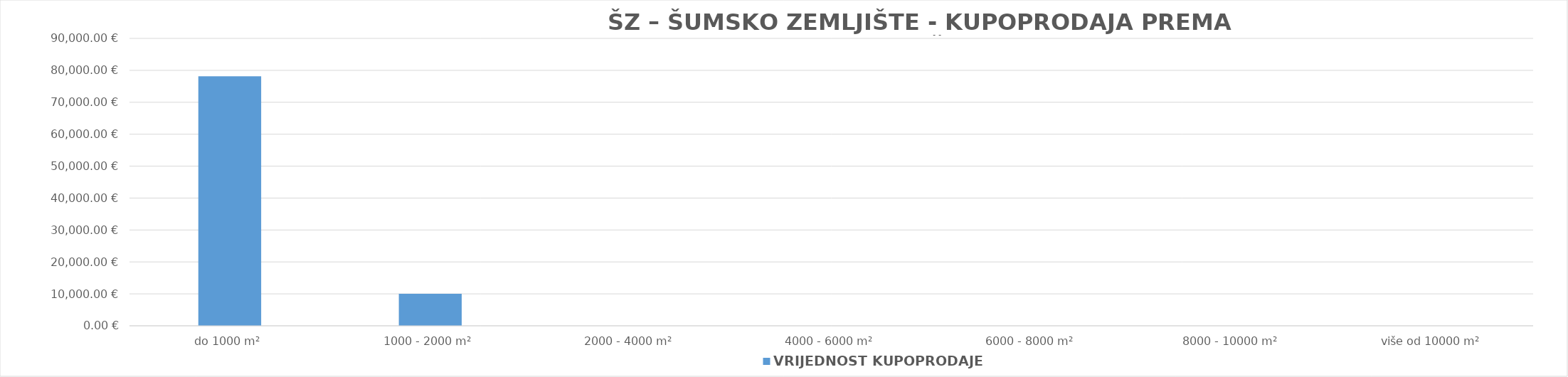
| Category | VRIJEDNOST KUPOPRODAJE 
(u EUR) |
|---|---|
| do 1000 m² | 78125 |
| 1000 - 2000 m² | 10000 |
| 2000 - 4000 m² | 0 |
| 4000 - 6000 m² | 0 |
| 6000 - 8000 m² | 0 |
| 8000 - 10000 m² | 0 |
| više od 10000 m² | 0 |